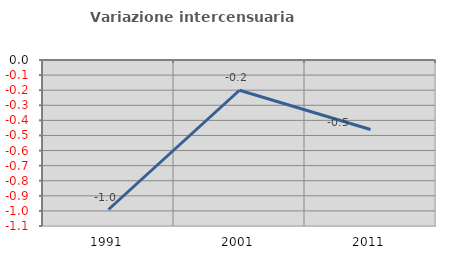
| Category | Variazione intercensuaria annua |
|---|---|
| 1991.0 | -0.991 |
| 2001.0 | -0.2 |
| 2011.0 | -0.461 |